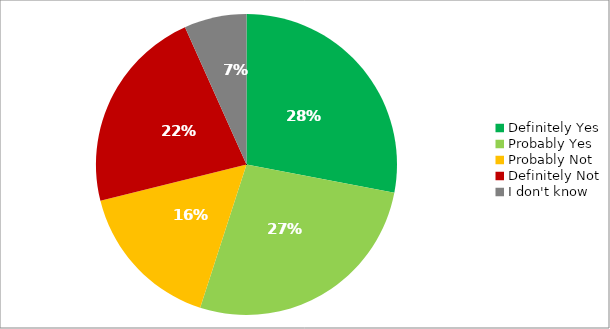
| Category | Responses |
|---|---|
| Definitely Yes | 0.28 |
| Probably Yes | 0.27 |
| Probably Not | 0.162 |
| Definitely Not | 0.222 |
| I don't know | 0.067 |